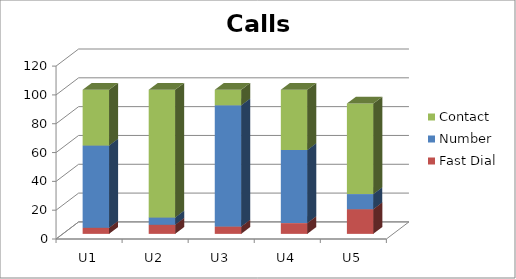
| Category | Fast Dial | Number | Contact |
|---|---|---|---|
| U1 | 4.202 | 57.143 | 38.655 |
| U2 | 6.329 | 5.063 | 88.608 |
| U3 | 5.075 | 84.179 | 10.746 |
| U4 | 7.463 | 50.746 | 41.791 |
| U5 | 17.143 | 10.476 | 62.857 |